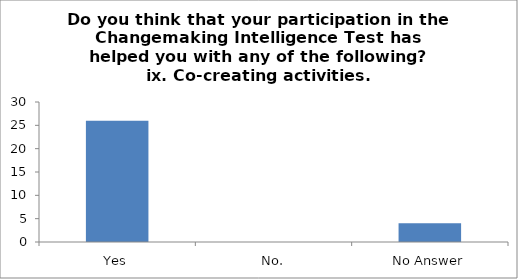
| Category | Do you think that your participation in the Changemaking Intelligence Test has helped you with any of the following?
ix. Co-creating activities. |
|---|---|
| Yes | 26 |
| No. | 0 |
| No Answer | 4 |